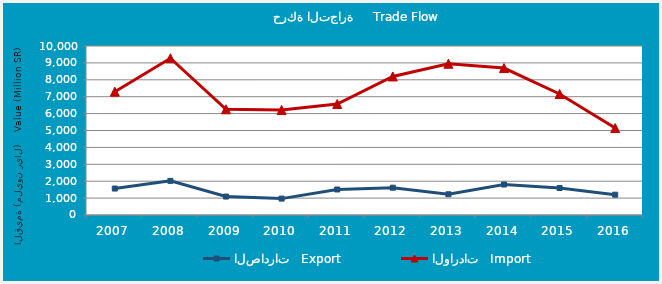
| Category | الصادرات   Export | الواردات   Import |
|---|---|---|
| 2007.0 | 1565.186 | 7295.727 |
| 2008.0 | 2018.423 | 9274.197 |
| 2009.0 | 1091.219 | 6256.319 |
| 2010.0 | 969.894 | 6215.644 |
| 2011.0 | 1509.945 | 6567.282 |
| 2012.0 | 1615.621 | 8198.655 |
| 2013.0 | 1227.11 | 8952.256 |
| 2014.0 | 1804.433 | 8694.141 |
| 2015.0 | 1595.232 | 7158.952 |
| 2016.0 | 1201.678 | 5144.17 |